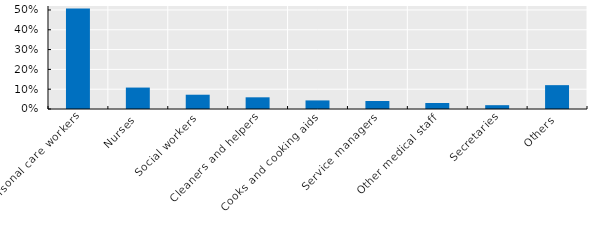
| Category | Series 0 |
|---|---|
| Personal care workers | 0.507 |
| Nurses | 0.108 |
| Social workers | 0.072 |
| Cleaners and helpers | 0.059 |
| Cooks and cooking aids | 0.043 |
| Service managers | 0.04 |
| Other medical staff | 0.03 |
| Secretaries | 0.019 |
| Others | 0.12 |